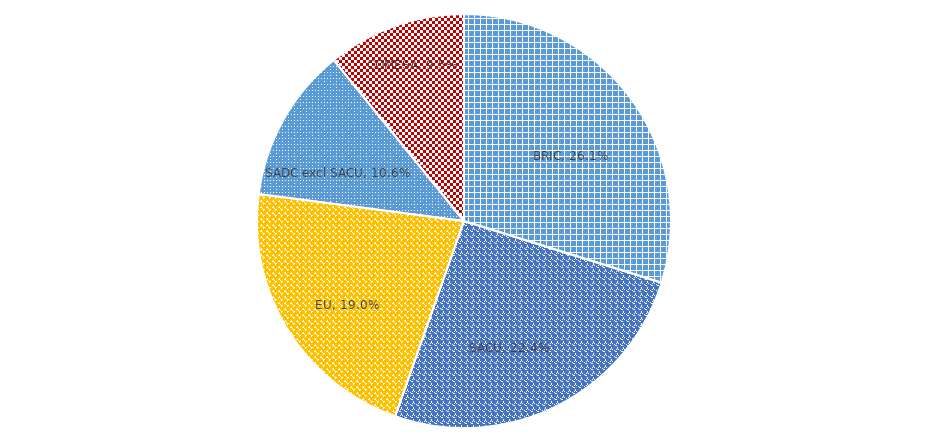
| Category | %Share |
|---|---|
| BRIC | 0.261 |
| SACU | 0.224 |
| EU | 0.19 |
| SADC excl SACU | 0.106 |
| COMESA | 0.095 |